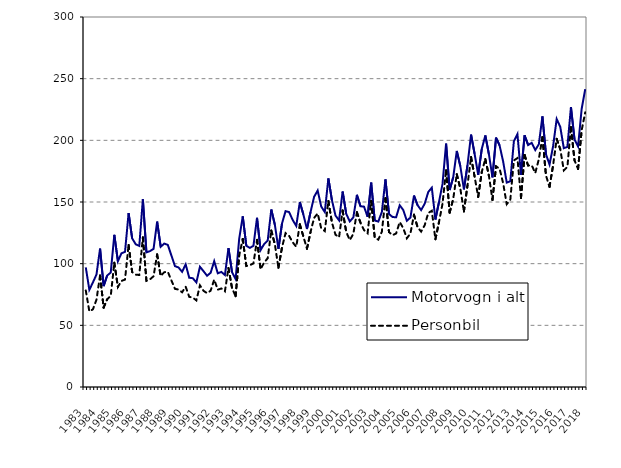
| Category | Motorvogn i alt | Personbil |
|---|---|---|
| 1983.0 | 97 | 78.3 |
| nan | 78.8 | 61.3 |
| nan | 84.8 | 63 |
| nan | 91.2 | 70.8 |
| 1984.0 | 112.2 | 90.4 |
| nan | 81.8 | 64.4 |
| nan | 90.4 | 71.1 |
| nan | 92.9 | 73.9 |
| 1985.0 | 123.4 | 100.8 |
| nan | 102 | 81.1 |
| nan | 108.4 | 86 |
| nan | 109.6 | 87.1 |
| 1986.0 | 141 | 115.2 |
| nan | 120.5 | 93.2 |
| nan | 115.7 | 91.1 |
| nan | 114.4 | 90.8 |
| 1987.0 | 152.2 | 121.3 |
| nan | 109.2 | 86.1 |
| nan | 110.1 | 87.3 |
| nan | 112 | 89.8 |
| 1988.0 | 134.1 | 107.5 |
| nan | 113.7 | 90 |
| nan | 116.3 | 93.1 |
| nan | 115.2 | 93.4 |
| 1989.0 | 106.6 | 86.4 |
| nan | 98 | 79.6 |
| nan | 96.9 | 79 |
| nan | 93.4 | 76.8 |
| 1990.0 | 99.4 | 81.3 |
| nan | 88.6 | 73.1 |
| nan | 88.2 | 72.5 |
| nan | 84.8 | 70.2 |
| 1991.0 | 97.5 | 82.4 |
| nan | 93.9 | 78 |
| nan | 90.2 | 76.1 |
| nan | 92.6 | 78.1 |
| 1992.0 | 102 | 87.1 |
| nan | 92.2 | 78.9 |
| nan | 93.3 | 79.9 |
| nan | 90.8 | 77.6 |
| 1993.0 | 112.6 | 96.5 |
| nan | 93 | 80.1 |
| nan | 87.5 | 73.6 |
| nan | 120.1 | 106.6 |
| 1994.0 | 138.4 | 120 |
| nan | 114.5 | 98.1 |
| nan | 112.8 | 98.8 |
| nan | 114.5 | 100.2 |
| 1995.0 | 137.2 | 119.3 |
| nan | 111 | 95.4 |
| nan | 115.9 | 101 |
| nan | 118.8 | 104.4 |
| 1996.0 | 143.9 | 126.9 |
| nan | 131.6 | 115.7 |
| nan | 112 | 96.7 |
| nan | 132.5 | 113.1 |
| 1997.0 | 142.6 | 124.8 |
| nan | 141.8 | 122.5 |
| nan | 135.4 | 117.3 |
| nan | 130.6 | 113.7 |
| 1998.0 | 150 | 131.9 |
| nan | 139.8 | 122 |
| nan | 128.1 | 112.1 |
| nan | 141.8 | 125.6 |
| 1999.0 | 154.2 | 137.1 |
| nan | 159.3 | 140.7 |
| nan | 146.3 | 128.7 |
| nan | 141.9 | 126.4 |
| 2000.0 | 169.1 | 150.9 |
| nan | 151.5 | 133.4 |
| nan | 139 | 123.5 |
| nan | 135.1 | 121.4 |
| 2001.0 | 158.5 | 143.1 |
| nan | 140.46 | 125.7 |
| nan | 134.24 | 119.2 |
| nan | 137.495 | 124.072 |
| 2002.0 | 155.814 | 141.724 |
| nan | 146.543 | 133.19 |
| nan | 146.231 | 127.141 |
| nan | 137.967 | 124.641 |
| 2003.0 | 165.679 | 150.811 |
| nan | 135.021 | 121.101 |
| nan | 134.111 | 119.491 |
| nan | 142.013 | 125.959 |
| 2004.0 | 168.309 | 153.043 |
| nan | 140.267 | 125.568 |
| nan | 137.77 | 123.121 |
| nan | 137.685 | 124.506 |
| 2005.0 | 147.311 | 133.756 |
| nan | 143.517 | 128.79 |
| nan | 134.783 | 120.571 |
| nan | 137.37 | 124.382 |
| 2006.0 | 155.213 | 139.728 |
| nan | 147.444 | 129.572 |
| nan | 143.451 | 126.006 |
| nan | 148.561 | 131.195 |
| 2007.0 | 158.1 | 141.084 |
| nan | 161.613 | 142.897 |
| nan | 135.821 | 119.753 |
| nan | 149.791 | 133.498 |
| 2008.0 | 164.642 | 148.614 |
| nan | 197.287 | 175.714 |
| nan | 159.718 | 141.407 |
| nan | 170.057 | 152.54 |
| 2009.0 | 191.38 | 172.559 |
| nan | 178.906 | 160.765 |
| nan | 160.234 | 142.312 |
| nan | 179.857 | 163.532 |
| 2010.0 | 204.636 | 186.507 |
| nan | 188.957 | 170.463 |
| nan | 172.077 | 154.156 |
| nan | 192.961 | 174.399 |
| 2011.0 | 204.005 | 184.86 |
| nan | 188.741 | 171.333 |
| nan | 169.934 | 151.694 |
| nan | 202.176 | 178.919 |
| 2012.0 | 195.829 | 177.072 |
| nan | 182.751 | 165.128 |
| nan | 165.73 | 148.242 |
| nan | 166.805 | 151.728 |
| 2013.0 | 199.181 | 183.653 |
| nan | 205.015 | 185.634 |
| nan | 172.044 | 153.21 |
| nan | 204.1 | 188.079 |
| 2014.0 | 196.177 | 179.552 |
| nan | 197.965 | 179.767 |
| nan | 192.105 | 173.474 |
| nan | 196.809 | 184.739 |
| 2015.0 | 219.419 | 202.592 |
| nan | 188.696 | 171.451 |
| nan | 180.388 | 162.297 |
| nan | 195.23 | 179.891 |
| 2016.0 | 217.298 | 201.197 |
| nan | 210.949 | 192.893 |
| nan | 193.648 | 175.642 |
| nan | 194.663 | 178.455 |
| 2017.0 | 227.029 | 210.738 |
| nan | 200.767 | 183.708 |
| nan | 195.059 | 176.766 |
| nan | 225.423 | 208.216 |
| 2018.0 | 241.528 | 222.678 |